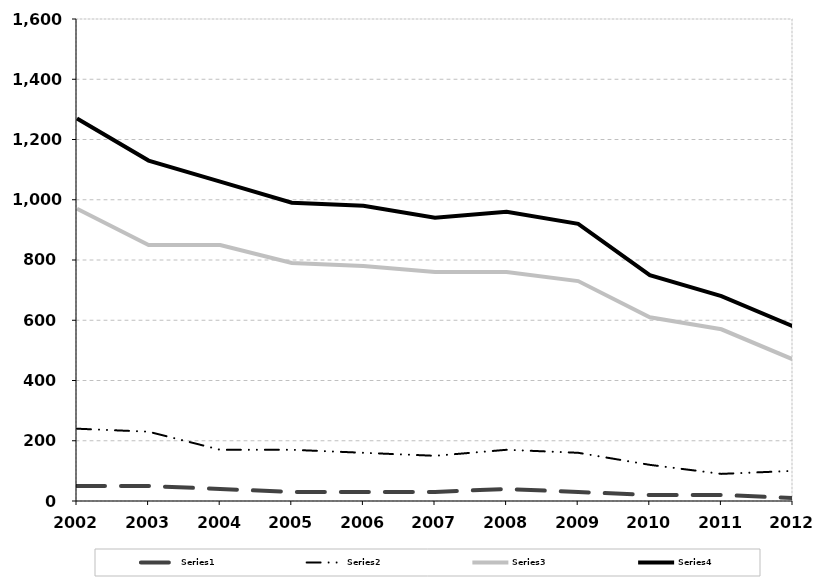
| Category | Series 0 | Series 1 | Series 2 | Series 3 |
|---|---|---|---|---|
| 2002.0 | 50 | 240 | 970 | 1270 |
| 2003.0 | 50 | 230 | 850 | 1130 |
| 2004.0 | 40 | 170 | 850 | 1060 |
| 2005.0 | 30 | 170 | 790 | 990 |
| 2006.0 | 30 | 160 | 780 | 980 |
| 2007.0 | 30 | 150 | 760 | 940 |
| 2008.0 | 40 | 170 | 760 | 960 |
| 2009.0 | 30 | 160 | 730 | 920 |
| 2010.0 | 20 | 120 | 610 | 750 |
| 2011.0 | 20 | 90 | 570 | 680 |
| 2012.0 | 10 | 100 | 470 | 580 |